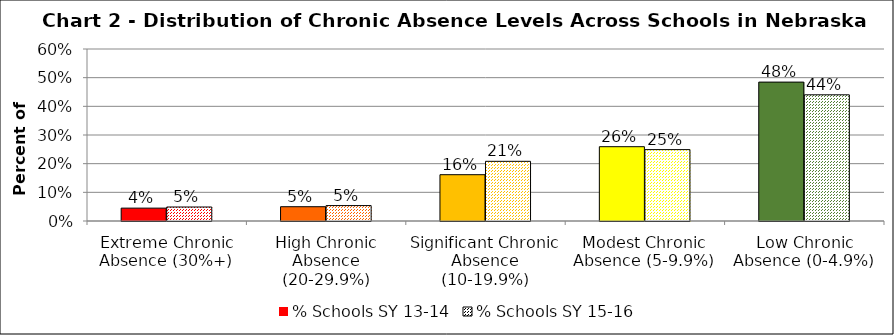
| Category | % Schools SY 13-14 | % Schools SY 15-16 |
|---|---|---|
| Extreme Chronic Absence (30%+) | 0.045 | 0.049 |
| High Chronic Absence (20-29.9%) | 0.05 | 0.054 |
| Significant Chronic Absence (10-19.9%) | 0.162 | 0.208 |
| Modest Chronic Absence (5-9.9%) | 0.259 | 0.249 |
| Low Chronic Absence (0-4.9%) | 0.485 | 0.44 |